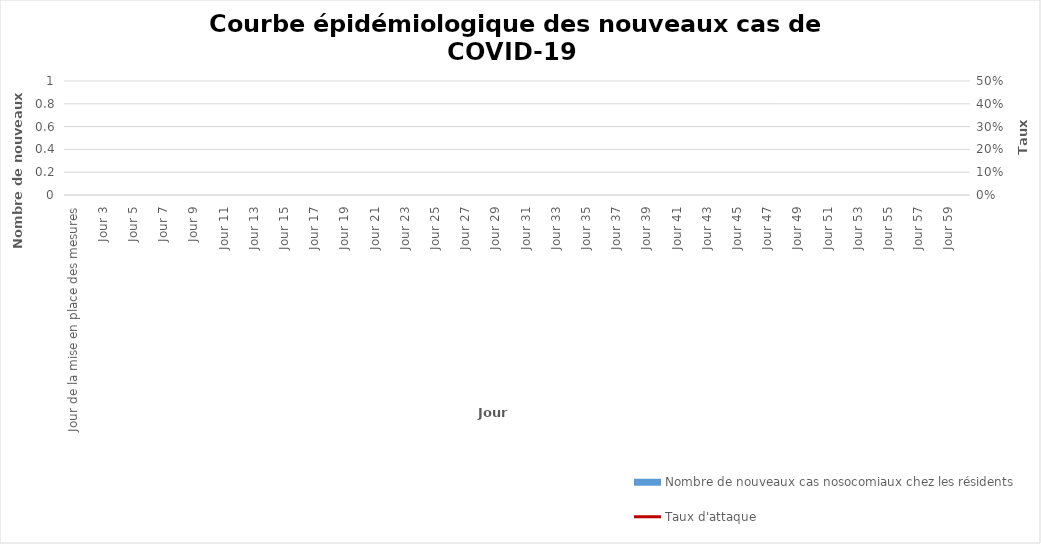
| Category | Nombre de nouveaux cas nosocomiaux chez les résidents |
|---|---|
| Jour de la mise en place des mesures | 0 |
| Jour 2 | 0 |
| Jour 3 | 0 |
| Jour 4 | 0 |
| Jour 5 | 0 |
| Jour 6 | 0 |
| Jour 7 | 0 |
| Jour 8 | 0 |
| Jour 9 | 0 |
| Jour 10 | 0 |
| Jour 11 | 0 |
| Jour 12 | 0 |
| Jour 13 | 0 |
| Jour 14 | 0 |
| Jour 15 | 0 |
| Jour 16 | 0 |
| Jour 17 | 0 |
| Jour 18 | 0 |
| Jour 19 | 0 |
| Jour 20 | 0 |
| Jour 21 | 0 |
| Jour 22 | 0 |
| Jour 23 | 0 |
| Jour 24 | 0 |
| Jour 25 | 0 |
| Jour 26 | 0 |
| Jour 27 | 0 |
| Jour 28 | 0 |
| Jour 29 | 0 |
| Jour 30 | 0 |
| Jour 31 | 0 |
| Jour 32 | 0 |
| Jour 33 | 0 |
| Jour 34 | 0 |
| Jour 35 | 0 |
| Jour 36 | 0 |
| Jour 37 | 0 |
| Jour 38 | 0 |
| Jour 39 | 0 |
| Jour 40 | 0 |
| Jour 41 | 0 |
| Jour 42 | 0 |
| Jour 43 | 0 |
| Jour 44 | 0 |
| Jour 45 | 0 |
| Jour 46 | 0 |
| Jour 47 | 0 |
| Jour 48 | 0 |
| Jour 49 | 0 |
| Jour 50 | 0 |
| Jour 51 | 0 |
| Jour 52 | 0 |
| Jour 53 | 0 |
| Jour 54 | 0 |
| Jour 55 | 0 |
| Jour 56 | 0 |
| Jour 57 | 0 |
| Jour 58 | 0 |
| Jour 59 | 0 |
| Jour 60 | 0 |